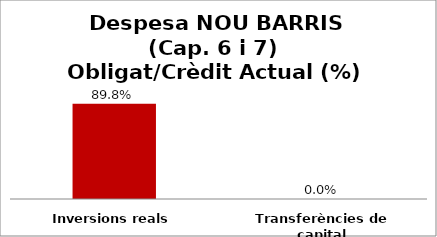
| Category | Series 0 |
|---|---|
| Inversions reals | 0.898 |
| Transferències de capital | 0 |